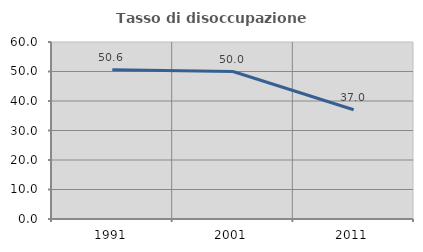
| Category | Tasso di disoccupazione giovanile  |
|---|---|
| 1991.0 | 50.617 |
| 2001.0 | 50 |
| 2011.0 | 37.037 |